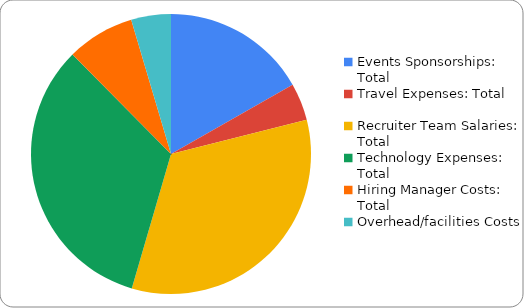
| Category | Total Expense |
|---|---|
| Events Sponsorships: Total | 95000 |
| Travel Expenses: Total | 24500 |
| Recruiter Team Salaries: Total | 189750 |
| Technology Expenses: Total  | 187500 |
| Hiring Manager Costs: Total | 44431.373 |
| Overhead/facilities Costs | 26026 |